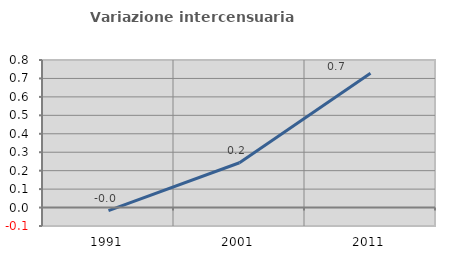
| Category | Variazione intercensuaria annua |
|---|---|
| 1991.0 | -0.017 |
| 2001.0 | 0.243 |
| 2011.0 | 0.729 |